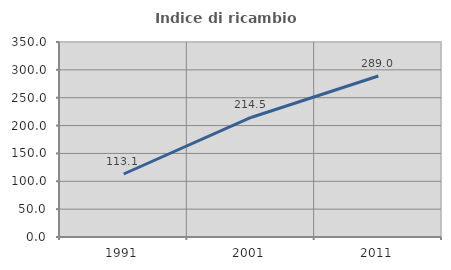
| Category | Indice di ricambio occupazionale  |
|---|---|
| 1991.0 | 113.077 |
| 2001.0 | 214.545 |
| 2011.0 | 288.983 |